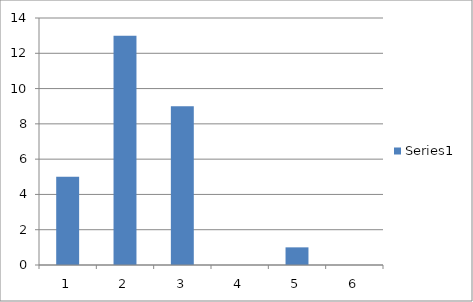
| Category | Series 0 |
|---|---|
| 0 | 5 |
| 1 | 13 |
| 2 | 9 |
| 3 | 0 |
| 4 | 1 |
| 5 | 0 |